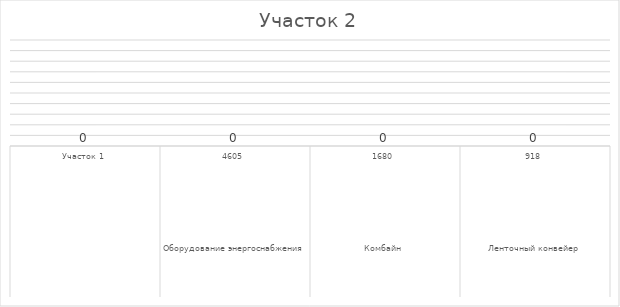
| Category | Участок 2 |
|---|---|
| Комбайн | 60 |
| Ленточный конвейер | 1215 |
| Лавный скребковый конвейер | 420 |
| ПТК | 55 |